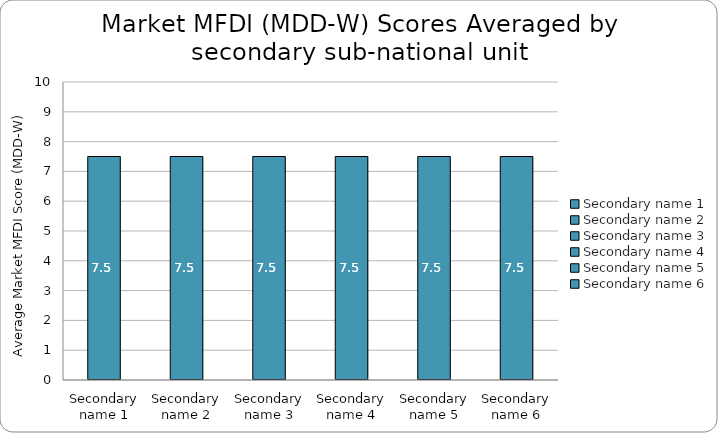
| Category | Series 0 |
|---|---|
| Secondary name 1 | 7.5 |
| Secondary name 2 | 7.5 |
| Secondary name 3 | 7.5 |
| Secondary name 4 | 7.5 |
| Secondary name 5 | 7.5 |
| Secondary name 6 | 7.5 |